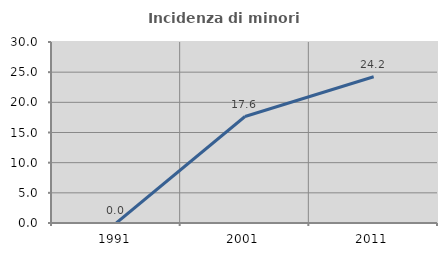
| Category | Incidenza di minori stranieri |
|---|---|
| 1991.0 | 0 |
| 2001.0 | 17.647 |
| 2011.0 | 24.242 |